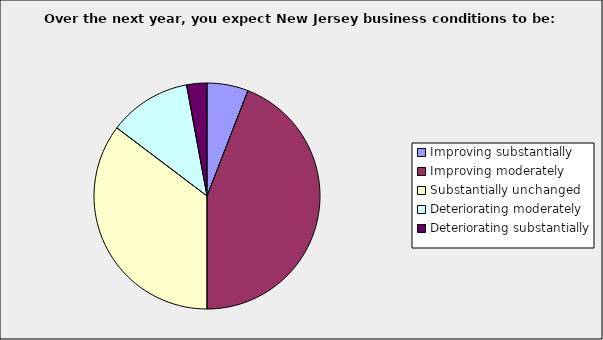
| Category | Series 0 |
|---|---|
| Improving substantially | 0.059 |
| Improving moderately | 0.441 |
| Substantially unchanged | 0.353 |
| Deteriorating moderately | 0.118 |
| Deteriorating substantially | 0.029 |